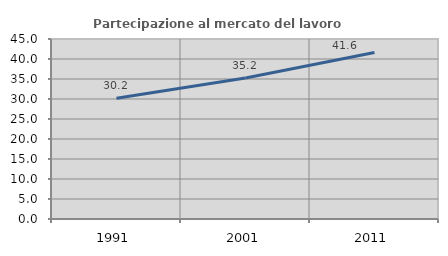
| Category | Partecipazione al mercato del lavoro  femminile |
|---|---|
| 1991.0 | 30.198 |
| 2001.0 | 35.229 |
| 2011.0 | 41.643 |